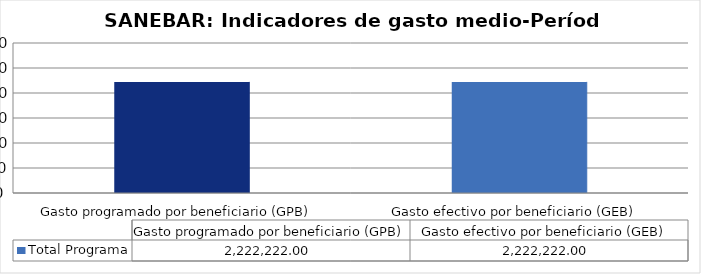
| Category | Total Programa |
|---|---|
| Gasto programado por beneficiario (GPB)  | 2222222 |
| Gasto efectivo por beneficiario (GEB)  | 2222222 |